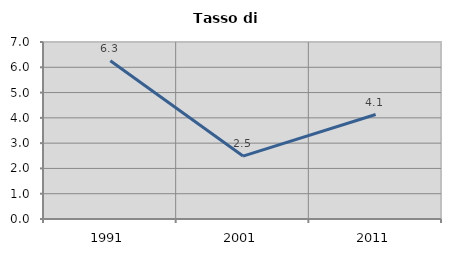
| Category | Tasso di disoccupazione   |
|---|---|
| 1991.0 | 6.259 |
| 2001.0 | 2.489 |
| 2011.0 | 4.131 |